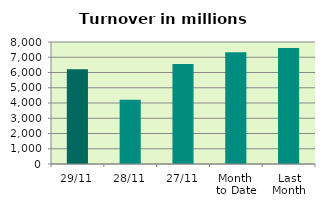
| Category | Series 0 |
|---|---|
| 29/11 | 6219.132 |
| 28/11 | 4218.608 |
| 27/11 | 6553.754 |
| Month 
to Date | 7326.344 |
| Last
Month | 7601.18 |